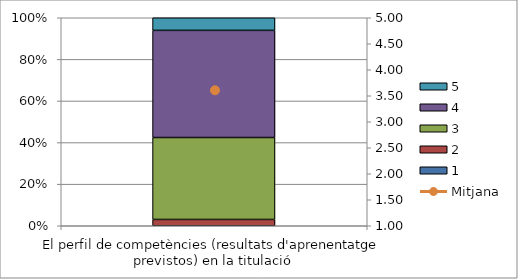
| Category | 1 | 2 | 3 | 4 | 5 |
|---|---|---|---|---|---|
| El perfil de competències (resultats d'aprenentatge previstos) en la titulació | 0 | 1 | 13 | 17 | 2 |